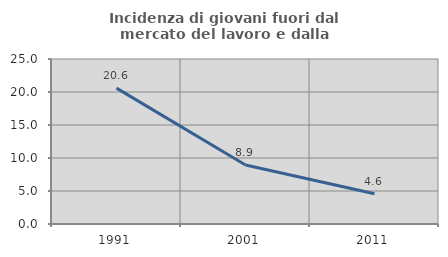
| Category | Incidenza di giovani fuori dal mercato del lavoro e dalla formazione  |
|---|---|
| 1991.0 | 20.588 |
| 2001.0 | 8.943 |
| 2011.0 | 4.587 |